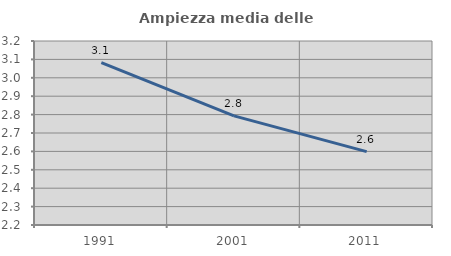
| Category | Ampiezza media delle famiglie |
|---|---|
| 1991.0 | 3.083 |
| 2001.0 | 2.793 |
| 2011.0 | 2.599 |